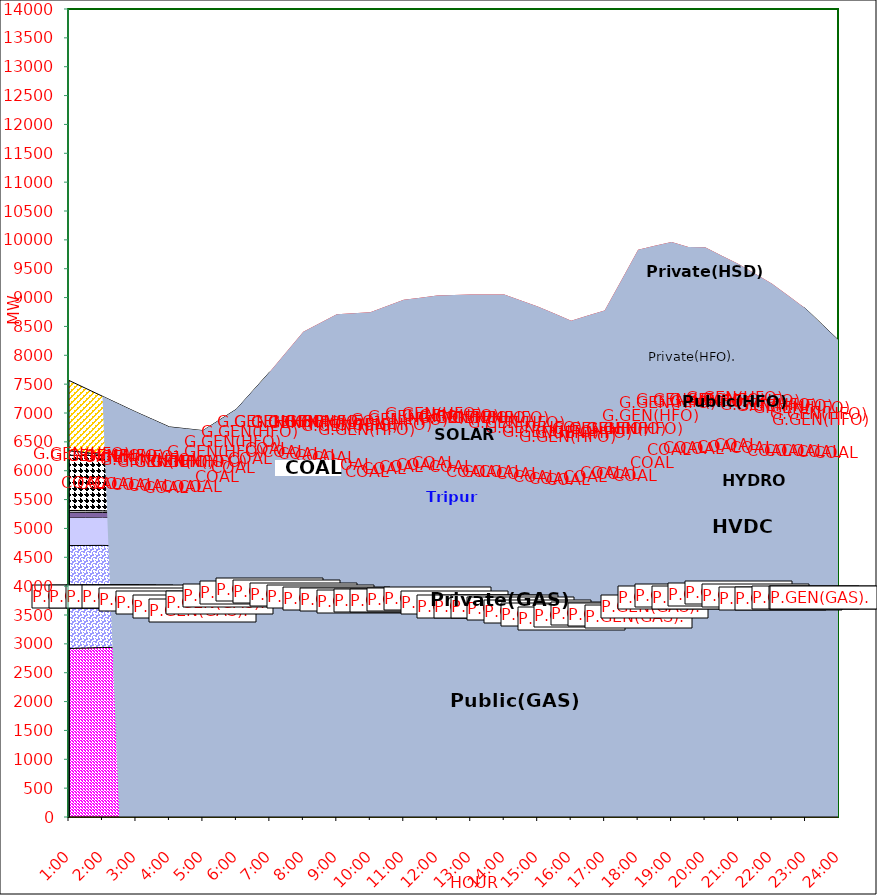
| Category | GAS | P.GEN(GAS). |  HVDC | TRIPURA | HYDRO | COAL | SOLAR | G.GEN(HFO) | P.GEN(HFO). | G.GEN(HSD) | P.GEN(HSD) | SHORTAGE | Total Energy Gen 193.080 MKWHr 
Energy Not Served   0.000 MKWHr 
Energy Requirement     193.080 MKWHr  |
|---|---|---|---|---|---|---|---|---|---|---|---|---|---|
| 1:00 | 2920 | 1783 | 488 | 90 | 30 | 957 | 0 | 81 | 1215 | 0 | 0 | 0 |  |
| 1:30 | 2928.5 | 1776 | 488.5 | 86 | 30 | 956.5 | 0 | 48.5 | 1113 | 0 | 0 | 0 |  |
| 2:00 | 2937 | 1769 | 489 | 82 | 30 | 956 | 0 | 16 | 1011 | 0 | 0 | 0 |  |
| 2:30 | 2941 | 1758.5 | 487 | 80 | 30 | 956.5 | 0 | 8 | 892.5 | 0 | 0 | 0 |  |
| 3:00 | 2945 | 1748 | 485 | 78 | 30 | 957 | 0 | 0 | 774 | 0 | 0 | 0 |  |
| 3:30 | 2910.5 | 1710.5 | 540.5 | 80 | 30 | 931 | 0 | 0 | 685.5 | 0 | 0 | 0 |  |
| 4:00 | 2876 | 1673 | 596 | 82 | 30 | 905 | 0 | 0 | 597 | 0 | 0 | 0 |  |
| 4:30 | 2812.5 | 1668.5 | 681.5 | 81 | 30 | 890.5 | 0 | 0 | 563 | 0 | 0 | 0 |  |
| 5:00 | 2749 | 1664 | 767 | 80 | 30 | 876 | 0 | 0 | 529 | 0 | 0 | 0 |  |
| 5:30 | 2858 | 1711 | 767 | 85 | 30 | 881 | 0 | 0 | 548 | 0 | 0 | 0 |  |
| 6:00 | 2967 | 1758 | 767 | 90 | 30 | 886 | 0 | 0 | 567 | 0 | 0 | 0 |  |
| 6:30 | 2982.5 | 1830.5 | 837.5 | 87 | 30 | 905.5 | 2.5 | 8 | 706 | 0 | 0 | 0 |  |
| 7:00 | 2998 | 1903 | 908 | 84 | 30 | 925 | 5 | 16 | 845 | 0 | 0 | 0 |  |
| 7:30 | 2960.5 | 1882.5 | 908 | 87 | 30 | 940 | 29 | 29 | 888.5 | 0 | 0 | 307.345 |  |
| 8:00 | 2923 | 1862 | 908 | 90 | 30 | 955 | 53 | 42 | 932 | 0 | 0 | 614.691 |  |
| 8:30 | 2887.5 | 1863.5 | 908 | 95 | 30 | 955 | 82 | 53.5 | 1027 | 0 | 0 | 658.465 |  |
| 9:00 | 2852 | 1865 | 908 | 100 | 30 | 955 | 111 | 65 | 1122 | 0 | 0 | 702.24 |  |
| 9:30 | 2846 | 1833.5 | 839 | 102 | 30 | 924 | 176 | 74.5 | 1166.5 | 0 | 0 | 735.878 |  |
| 10:00 | 2840 | 1802 | 770 | 104 | 30 | 893 | 241 | 84 | 1211 | 0 | 0 | 769.515 |  |
| 10:30 | 2856 | 1780 | 824 | 105 | 30 | 882.5 | 273 | 110.5 | 1263 | 0 | 0 | 728.966 |  |
| 11:00 | 2872 | 1758 | 878 | 106 | 30 | 872 | 305 | 137 | 1315 | 0 | 0 | 688.417 |  |
| 11:30 | 2893.5 | 1746.5 | 895.5 | 110 | 30 | 867.5 | 321 | 149.5 | 1330.5 | 0 | 0 | 654.779 |  |
| 12:00 | 2915 | 1735 | 913 | 114 | 30 | 863 | 337 | 162 | 1346 | 0 | 0 | 621.142 |  |
| 12:30 | 2874 | 1688 | 912.5 | 109 | 30 | 903.5 | 331 | 209 | 1357 | 0 | 0 | 630.571 |  |
| 13:00 | 2833 | 1641 | 912 | 104 | 30 | 944 | 325 | 256 | 1368 | 0 | 0 | 640 |  |
| 13:30 | 2833 | 1641 | 912 | 104 | 30 | 944 | 325 | 256 | 1368 | 0 | 0 | 640 |  |
| 14:00 | 2833 | 1641 | 912 | 104 | 30 | 944 | 325 | 256 | 1368 | 0 | 0 | 640 |  |
| 14:30 | 2792 | 1631 | 912 | 106 | 30 | 949 | 257 | 311.5 | 1369 | 3.5 | 0 | 588 |  |
| 15:00 | 2751 | 1621 | 912 | 108 | 30 | 954 | 189 | 367 | 1370 | 7 | 0 | 536 |  |
| 15:30 | 2656 | 1695 | 912 | 104 | 30 | 948 | 140.5 | 373 | 1413 | 17 | 0 | 433.884 |  |
| 16:00 | 2561 | 1769 | 912 | 100 | 30 | 942 | 92 | 379 | 1456 | 27 | 0 | 331.767 |  |
| 16:30 | 2598.5 | 1774.5 | 912 | 98 | 30 | 986.5 | 55.5 | 412.5 | 1494.5 | 18.5 | 0 | 307.345 |  |
| 17:00 | 2636 | 1780 | 912 | 96 | 30 | 1031 | 19 | 446 | 1533 | 10 | 0 | 282.924 |  |
| 17:30 | 2624.5 | 1755 | 912 | 107 | 15 | 1066 | 9.5 | 478.5 | 1766.5 | 5 | 0 | 563.082 |  |
| 18:00 | 2613 | 1730 | 912 | 118 | 0 | 1101 | 0 | 511 | 2000 | 0 | 0 | 843.241 |  |
| 18:30 | 2741 | 1806.5 | 912 | 115 | 15 | 1104 | 0 | 527.5 | 2033.5 | 0 | 15 | 627.132 |  |
| 19:00 | 2869 | 1883 | 912 | 112 | 30 | 1107 | 0 | 544 | 2067 | 0 | 30 | 411.022 |  |
| 19:30 | 2885 | 1921 | 912 | 108 | 30 | 1107 | 0 | 533 | 1944 | 0 | 55 | 382.914 |  |
| 20:00 | 2844 | 1924 | 913 | 114 | 30 | 1107 | 0 | 539 | 2024 | 0 | 20 | 354.806 |  |
| 20:30 | 2885.5 | 1928.5 | 912.5 | 110 | 30 | 1107 | 0 | 529.5 | 1908 | 0 | 19 | 294.904 |  |
| 21:00 | 2927 | 1933 | 912 | 106 | 30 | 1107 | 0 | 520 | 1792 | 0 | 18 | 235.002 |  |
| 21:30 | 2879 | 1925.5 | 912 | 107 | 30 | 1107 | 0 | 508.5 | 1762 | 0 | 10.5 | 169.109 |  |
| 22:00 | 2831 | 1918 | 912 | 108 | 30 | 1107 | 0 | 497 | 1732 | 0 | 3 | 103.216 |  |
| 22:30 | 2830.5 | 1924.5 | 912.5 | 106 | 30 | 1094.5 | 0 | 447 | 1627 | 0 | 3 | 51.608 |  |
| 23:00 | 2830 | 1931 | 913 | 104 | 30 | 1082 | 0 | 397 | 1522 | 0 | 3 | 0 |  |
| 23:30 | 2830.5 | 1933.5 | 912.5 | 100 | 30 | 1056.5 | 0 | 255 | 1413.5 | 0 | 1.5 | 0 |  |
| 24:00 | 2831 | 1936 | 912 | 96 | 30 | 1031 | 0 | 113 | 1305 | 0 | 0 | 0 |  |